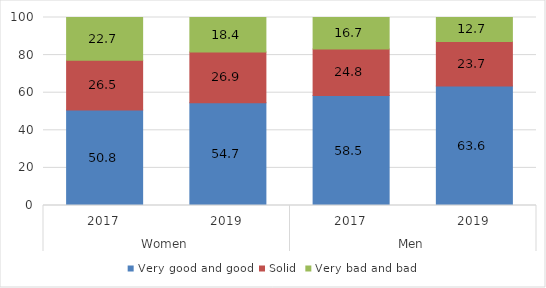
| Category | Very good and good | Solid | Very bad and bad |
|---|---|---|---|
| 0 | 50.8 | 26.5 | 22.7 |
| 1 | 54.7 | 26.9 | 18.4 |
| 2 | 58.5 | 24.8 | 16.7 |
| 3 | 63.6 | 23.7 | 12.7 |